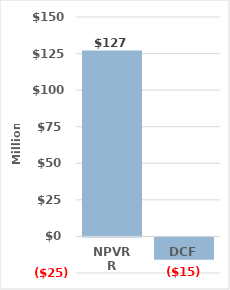
| Category | Series 0 |
|---|---|
| NPVRR | 127.047 |
| DCF | -15.213 |